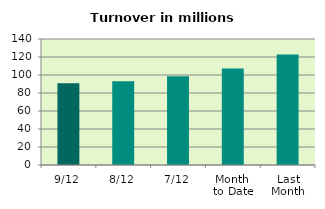
| Category | Series 0 |
|---|---|
| 9/12 | 90.849 |
| 8/12 | 92.965 |
| 7/12 | 98.577 |
| Month 
to Date | 107.348 |
| Last
Month | 122.873 |